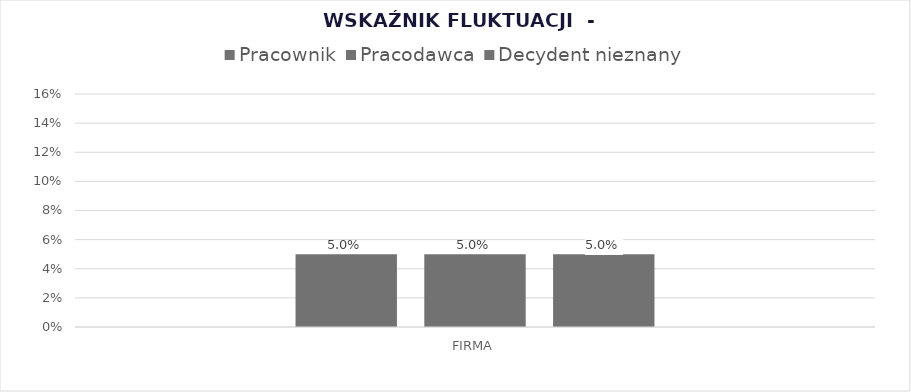
| Category | Pracownik | Pracodawca | Decydent nieznany |
|---|---|---|---|
| FIRMA | 0.05 | 0.05 | 0.05 |